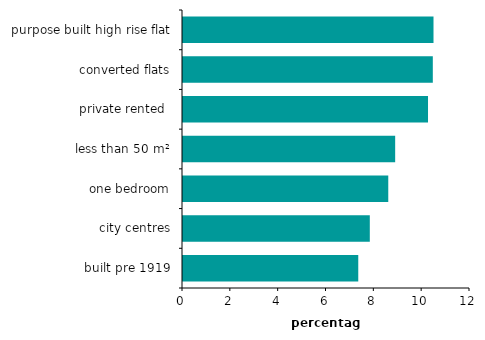
| Category | Series 0 |
|---|---|
| purpose built high rise flat | 10.474 |
| converted flats | 10.445 |
| private rented  | 10.244 |
| less than 50 m² | 8.871 |
| one bedroom | 8.583 |
| city centres | 7.811 |
| built pre 1919 | 7.328 |